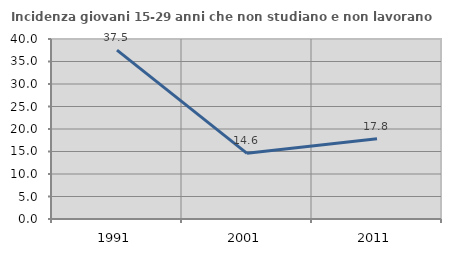
| Category | Incidenza giovani 15-29 anni che non studiano e non lavorano  |
|---|---|
| 1991.0 | 37.525 |
| 2001.0 | 14.587 |
| 2011.0 | 17.81 |